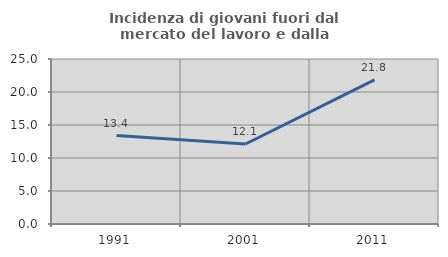
| Category | Incidenza di giovani fuori dal mercato del lavoro e dalla formazione  |
|---|---|
| 1991.0 | 13.396 |
| 2001.0 | 12.121 |
| 2011.0 | 21.845 |